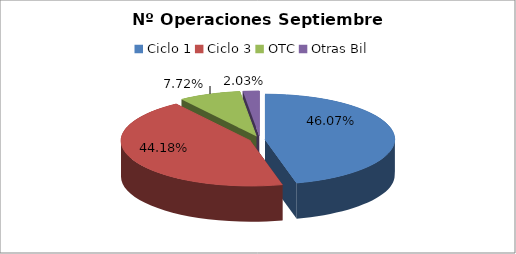
| Category | Series 0 |
|---|---|
| Ciclo 1 | 56122 |
| Ciclo 3 | 53821 |
| OTC | 9408 |
| Otras Bil | 2468 |